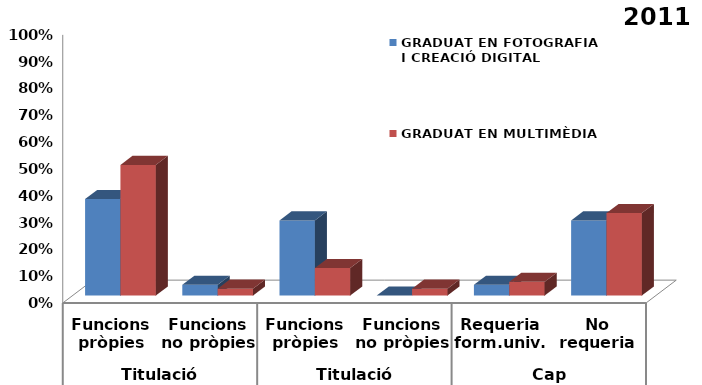
| Category | GRADUAT EN FOTOGRAFIA I CREACIÓ DIGITAL | GRADUAT EN MULTIMÈDIA |
|---|---|---|
| 0 | 0.36 | 0.487 |
| 1 | 0.04 | 0.026 |
| 2 | 0.28 | 0.103 |
| 3 | 0 | 0.026 |
| 4 | 0.04 | 0.051 |
| 5 | 0.28 | 0.308 |